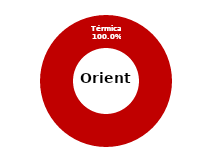
| Category | Oriente |
|---|---|
| Eólica | 0 |
| Hidráulica | 0 |
| Solar | 0 |
| Térmica | 34.096 |